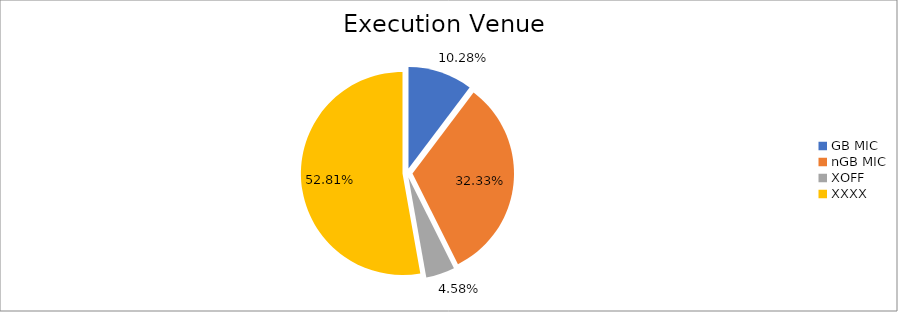
| Category | Series 0 |
|---|---|
| GB MIC | 984054.269 |
| nGB MIC | 3094237.325 |
| XOFF | 438568.545 |
| XXXX | 5054677.499 |